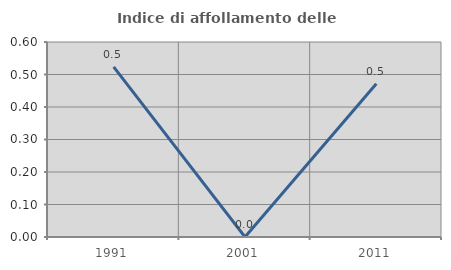
| Category | Indice di affollamento delle abitazioni  |
|---|---|
| 1991.0 | 0.524 |
| 2001.0 | 0 |
| 2011.0 | 0.472 |